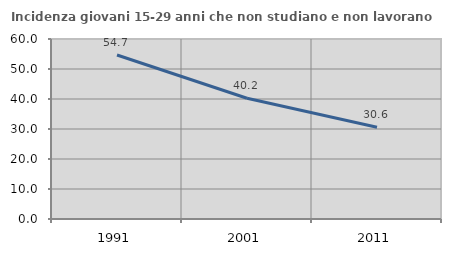
| Category | Incidenza giovani 15-29 anni che non studiano e non lavorano  |
|---|---|
| 1991.0 | 54.679 |
| 2001.0 | 40.239 |
| 2011.0 | 30.569 |